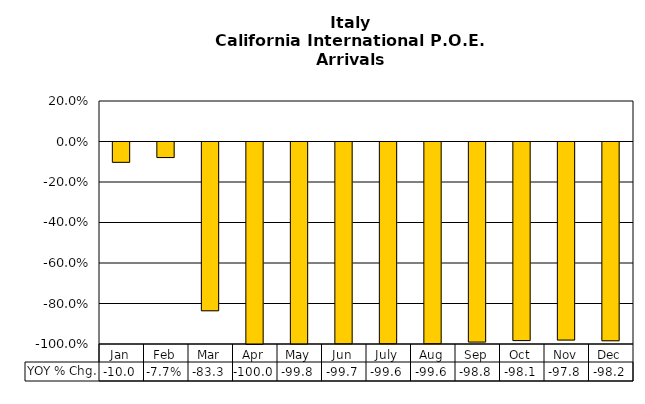
| Category | YOY % Chg. |
|---|---|
| Jan | -0.1 |
| Feb | -0.077 |
| Mar | -0.833 |
| Apr | -1 |
| May | -0.998 |
| Jun | -0.997 |
| July | -0.996 |
| Aug | -0.996 |
| Sep | -0.988 |
| Oct | -0.981 |
| Nov | -0.978 |
| Dec | -0.982 |